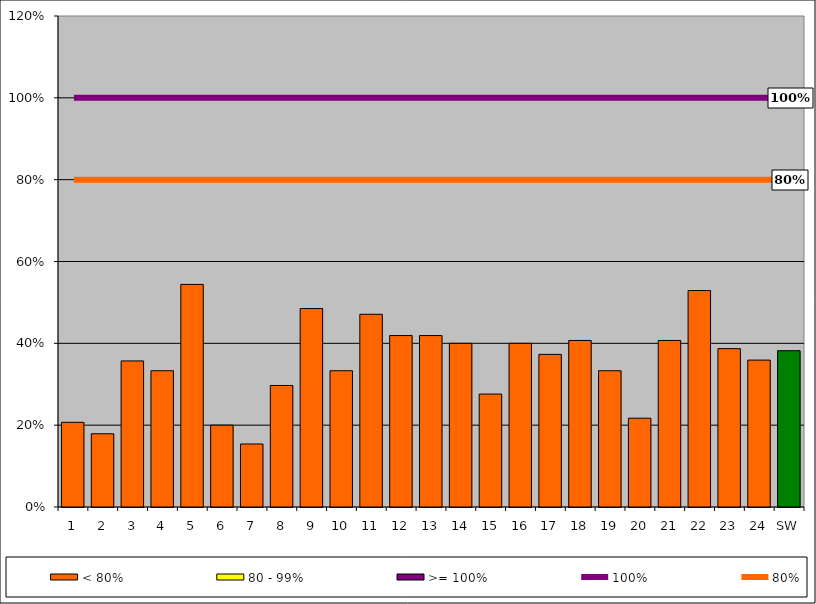
| Category | < 80% | 80 - 99% | >= 100% |
|---|---|---|---|
| 1 | 0.207 | 0 | 0 |
| 2 | 0.179 | 0 | 0 |
| 3 | 0.357 | 0 | 0 |
| 4 | 0.333 | 0 | 0 |
| 5 | 0.544 | 0 | 0 |
| 6 | 0.2 | 0 | 0 |
| 7 | 0.154 | 0 | 0 |
| 8 | 0.297 | 0 | 0 |
| 9 | 0.485 | 0 | 0 |
| 10 | 0.333 | 0 | 0 |
| 11 | 0.471 | 0 | 0 |
| 12 | 0.419 | 0 | 0 |
| 13 | 0.419 | 0 | 0 |
| 14 | 0.4 | 0 | 0 |
| 15 | 0.276 | 0 | 0 |
| 16 | 0.4 | 0 | 0 |
| 17 | 0.373 | 0 | 0 |
| 18 | 0.407 | 0 | 0 |
| 19 | 0.333 | 0 | 0 |
| 20 | 0.217 | 0 | 0 |
| 21 | 0.407 | 0 | 0 |
| 22 | 0.529 | 0 | 0 |
| 23 | 0.387 | 0 | 0 |
| 24 | 0.359 | 0 | 0 |
| SW | 0.382 | 0 | 0 |